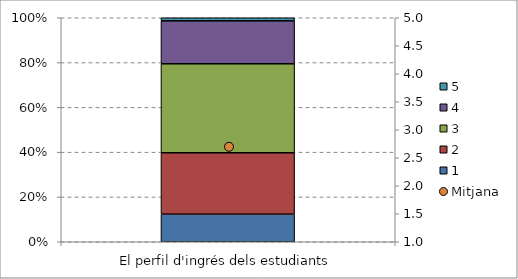
| Category | 1 | 2 | 3 | 4 | 5 |
|---|---|---|---|---|---|
| El perfil d'ingrés dels estudiants | 9 | 20 | 29 | 14 | 1 |